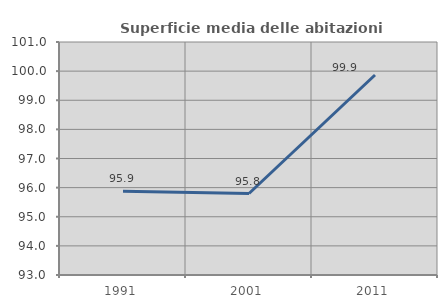
| Category | Superficie media delle abitazioni occupate |
|---|---|
| 1991.0 | 95.879 |
| 2001.0 | 95.798 |
| 2011.0 | 99.867 |